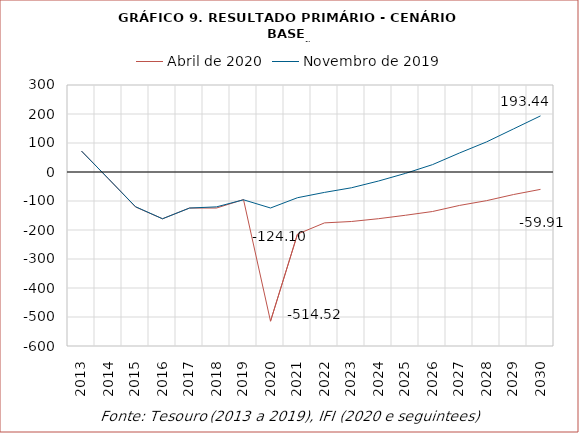
| Category | Abril de 2020 | Novembro de 2019 |
|---|---|---|
| 2013.0 | 72159.145 | 72159.145 |
| 2014.0 | -23482.403 | -23482.403 |
| 2015.0 | -120502.227 | -119647.227 |
| 2016.0 | -161275.625 | -161275.625 |
| 2017.0 | -124261.487 | -124261.487 |
| 2018.0 | -124242.257 | -120221.282 |
| 2019.0 | -95064.747 | -95798.228 |
| 2020.0 | -514515.274 | -124100 |
| 2021.0 | -214133.587 | -88662.443 |
| 2022.0 | -175447.442 | -70322.639 |
| 2023.0 | -170654.548 | -54318.489 |
| 2024.0 | -161032.784 | -31115.053 |
| 2025.0 | -149157.629 | -4719.398 |
| 2026.0 | -136242.065 | 25426.623 |
| 2027.0 | -115282.462 | 65571.168 |
| 2028.0 | -98843.031 | 103682.428 |
| 2029.0 | -77718.256 | 148561.203 |
| 2030.0 | -59909.619 | 193444.001 |